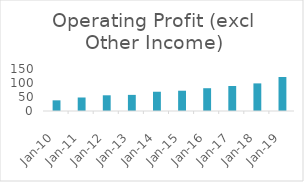
| Category | Operating Profit (excl Other Income) |
|---|---|
| 2010-03-31 | 38.09 |
| 2011-03-31 | 48.21 |
| 2012-03-31 | 56.09 |
| 2013-03-31 | 57.55 |
| 2014-03-31 | 68.78 |
| 2015-03-31 | 72.44 |
| 2016-03-31 | 81.38 |
| 2017-03-31 | 89.28 |
| 2018-03-31 | 98.61 |
| 2019-03-31 | 121.44 |